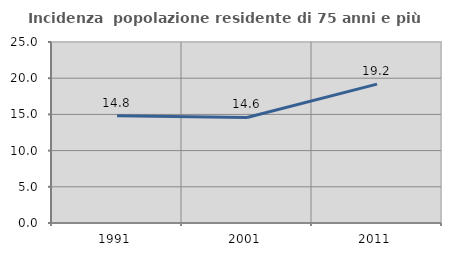
| Category | Incidenza  popolazione residente di 75 anni e più |
|---|---|
| 1991.0 | 14.815 |
| 2001.0 | 14.573 |
| 2011.0 | 19.186 |